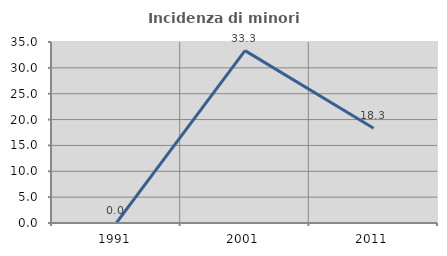
| Category | Incidenza di minori stranieri |
|---|---|
| 1991.0 | 0 |
| 2001.0 | 33.333 |
| 2011.0 | 18.31 |